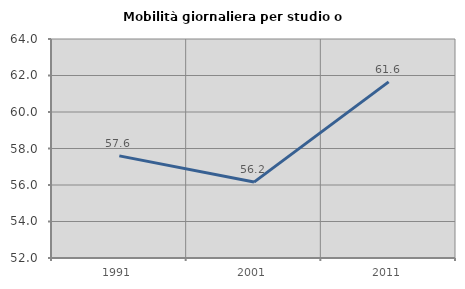
| Category | Mobilità giornaliera per studio o lavoro |
|---|---|
| 1991.0 | 57.597 |
| 2001.0 | 56.159 |
| 2011.0 | 61.649 |